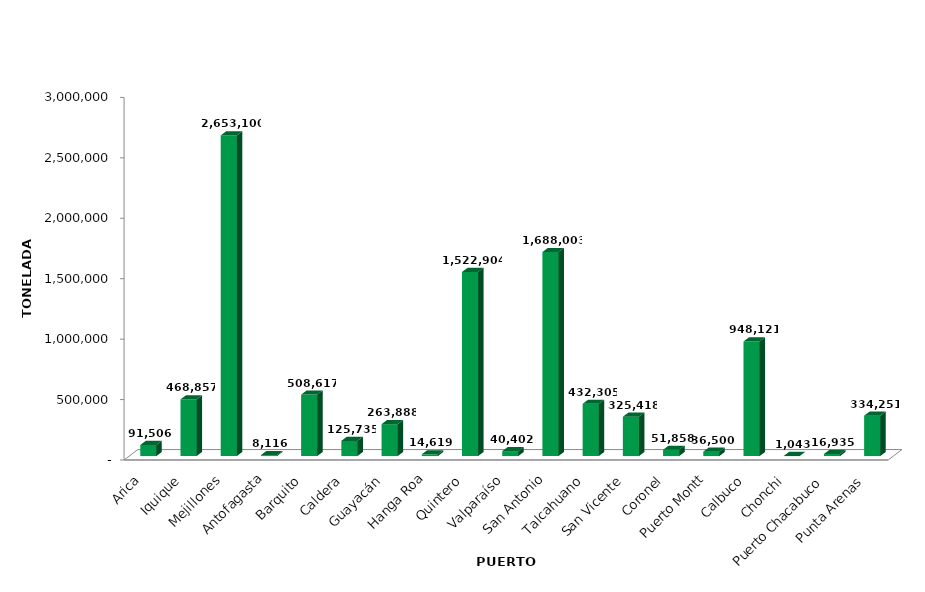
| Category | Series 0 |
|---|---|
| Arica | 91505.548 |
| Iquique | 468856.604 |
| Mejillones | 2653100.31 |
| Antofagasta | 8116.052 |
| Barquito | 508616.988 |
| Caldera | 125735.395 |
| Guayacán | 263887.845 |
| Hanga Roa | 14618.79 |
| Quintero | 1522903.664 |
| Valparaíso | 40401.922 |
| San Antonio | 1688002.73 |
| Talcahuano | 432305.397 |
| San Vicente | 325417.564 |
| Coronel | 51858.172 |
| Puerto Montt | 36500 |
| Calbuco | 948120.62 |
| Chonchi | 1042.533 |
| Puerto Chacabuco | 16934.792 |
| Punta Arenas | 334250.674 |